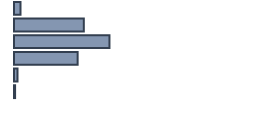
| Category | Percentatge |
|---|---|
| 0 | 2.727 |
| 1 | 29.091 |
| 2 | 39.773 |
| 3 | 26.515 |
| 4 | 1.439 |
| 5 | 0.455 |